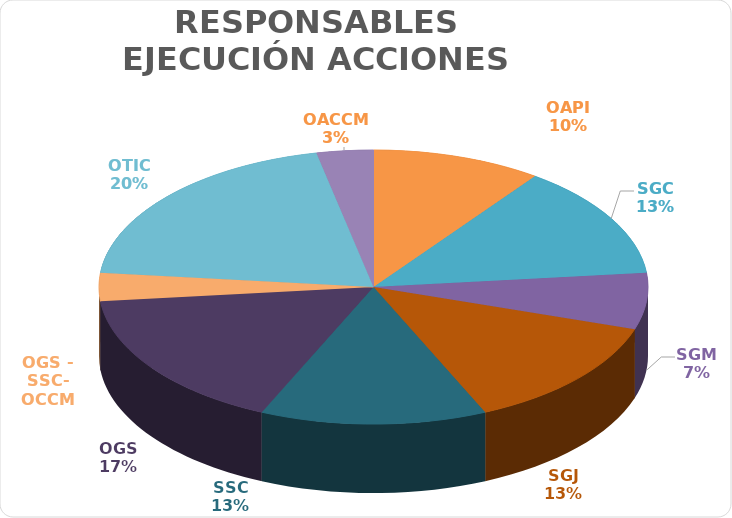
| Category | Series 0 |
|---|---|
| OAPI | 3 |
| SGC | 4 |
| SGM | 2 |
| SGJ | 4 |
| SSC | 4 |
| OGS | 5 |
| OGS - SSC- OCCM | 1 |
| OTIC | 6 |
| OACCM | 1 |